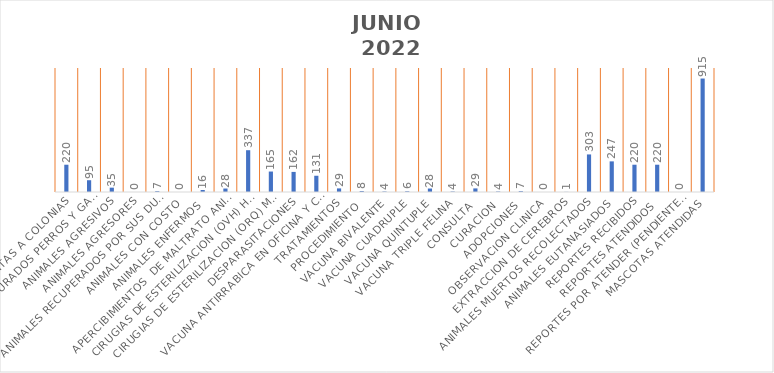
| Category | Series 0 |
|---|---|
| VISITAS A COLONIAS | 220 |
| ANIMALES CAPTURADOS PERROS Y GATOS  | 95 |
| ANIMALES AGRESIVOS | 35 |
| ANIMALES AGRESORES | 0 |
| ANIMALES RECUPERADOS POR SUS DUEÑOS | 7 |
| ANIMALES CON COSTO | 0 |
| ANIMALES ENFERMOS | 16 |
| APERCIBIMIENTOS  DE MALTRATO ANIMAL | 28 |
| CIRUGIAS DE ESTERILIZACION (OVH) hembra | 337 |
| CIRUGIAS DE ESTERILIZACION (ORQ) macho | 165 |
| DESPARASITACIONES | 162 |
| VACUNA ANTIRRABICA EN OFICINA Y CAMPAÑAS PASEOS DEL PRADO Y FOVISSSTE MIRAVALLE | 131 |
| TRATAMIENTOS | 29 |
| PROCEDIMIENTO | 8 |
| VACUNA BIVALENTE | 4 |
| VACUNA CUADRUPLE | 6 |
| VACUNA QUINTUPLE | 28 |
| VACUNA TRIPLE FELINA | 4 |
| CONSULTA | 29 |
| CURACION | 4 |
| ADOPCIONES | 7 |
| OBSERVACION CLINICA | 0 |
| EXTRACCION DE CEREBROS | 1 |
| ANIMALES MUERTOS RECOLECTADOS | 303 |
| ANIMALES EUTANASIADOS | 247 |
| REPORTES RECIBIDOS | 220 |
| REPORTES ATENDIDOS  | 220 |
| REPORTES POR ATENDER (PENDIENTES) | 0 |
| MASCOTAS ATENDIDAS | 915 |